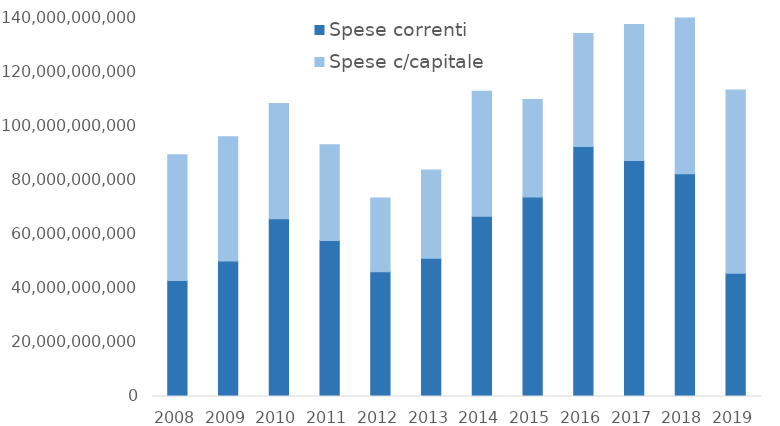
| Category | Spese correnti | Spese c/capitale |
|---|---|---|
| 2008.0 | 42893953000 | 46442360000 |
| 2009.0 | 50059217000 | 45866639000 |
| 2010.0 | 65621000000 | 42582000000 |
| 2011.0 | 57583816390.88 | 35380027229.73 |
| 2012.0 | 46058542143.35 | 27288631413.08 |
| 2013.0 | 51042043323.31 | 32608325232.85 |
| 2014.0 | 66601643726.18 | 46189902501.64 |
| 2015.0 | 73736463947.24 | 35954785504.87 |
| 2016.0 | 92316792259.88 | 41756911077.56 |
| 2017.0 | 87211420097.46 | 50218793198.99 |
| 2018.0 | 82319023262.39 | 57536065822.9 |
| 2019.0 | 45529016908.88 | 67732785328.95 |